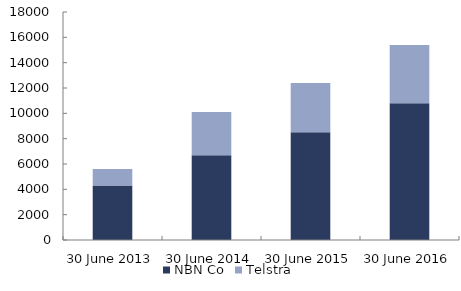
| Category | NBN Co | Telstra |
|---|---|---|
| 2013-06-30 | 4300 | 1300 |
| 2014-06-30 | 6700 | 3400 |
| 2015-06-30 | 8500 | 3900 |
| 2016-06-30 | 10800 | 4600 |